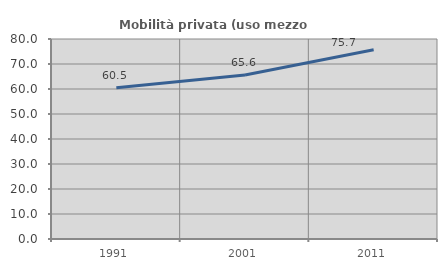
| Category | Mobilità privata (uso mezzo privato) |
|---|---|
| 1991.0 | 60.521 |
| 2001.0 | 65.615 |
| 2011.0 | 75.716 |